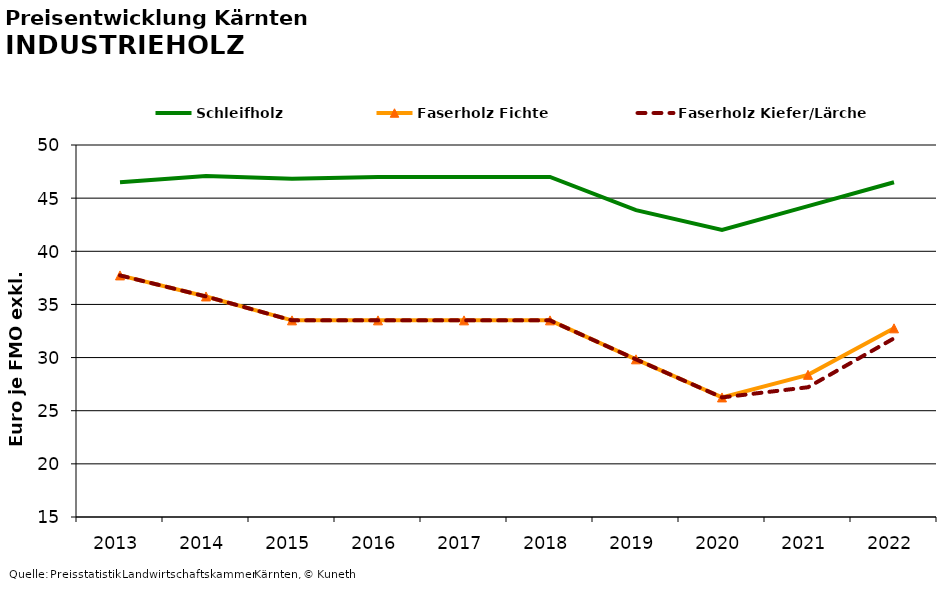
| Category | Schleifholz | Faserholz Fichte | Faserholz Kiefer/Lärche |
|---|---|---|---|
| 2013.0 | 46.5 | 37.729 | 37.729 |
| 2014.0 | 47.083 | 35.75 | 35.75 |
| 2015.0 | 46.833 | 33.5 | 33.5 |
| 2016.0 | 47 | 33.5 | 33.5 |
| 2017.0 | 47 | 33.5 | 33.5 |
| 2018.0 | 47 | 33.5 | 33.5 |
| 2019.0 | 43.875 | 29.833 | 29.833 |
| 2020.0 | 42 | 26.25 | 26.25 |
| 2021.0 | 44.25 | 28.375 | 27.208 |
| 2022.0 | 46.5 | 32.75 | 31.812 |